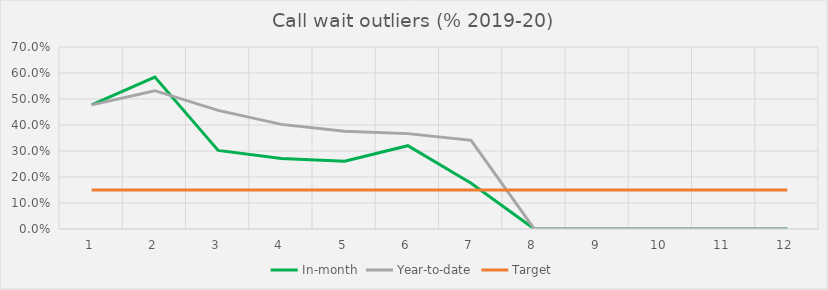
| Category | In-month | Year-to-date | Target |
|---|---|---|---|
| 0 | 0.477 | 0.477 | 0.15 |
| 1 | 0.584 | 0.532 | 0.15 |
| 2 | 0.302 | 0.456 | 0.15 |
| 3 | 0.271 | 0.402 | 0.15 |
| 4 | 0.261 | 0.376 | 0.15 |
| 5 | 0.32 | 0.367 | 0.15 |
| 6 | 0.176 | 0.341 | 0.15 |
| 7 | 0 | 0 | 0.15 |
| 8 | 0 | 0 | 0.15 |
| 9 | 0 | 0 | 0.15 |
| 10 | 0 | 0 | 0.15 |
| 11 | 0 | 0 | 0.15 |